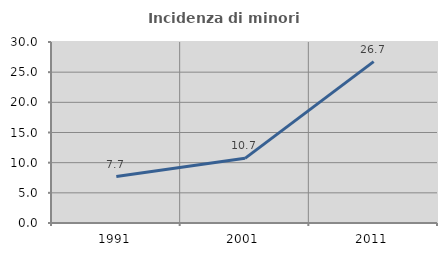
| Category | Incidenza di minori stranieri |
|---|---|
| 1991.0 | 7.692 |
| 2001.0 | 10.714 |
| 2011.0 | 26.744 |